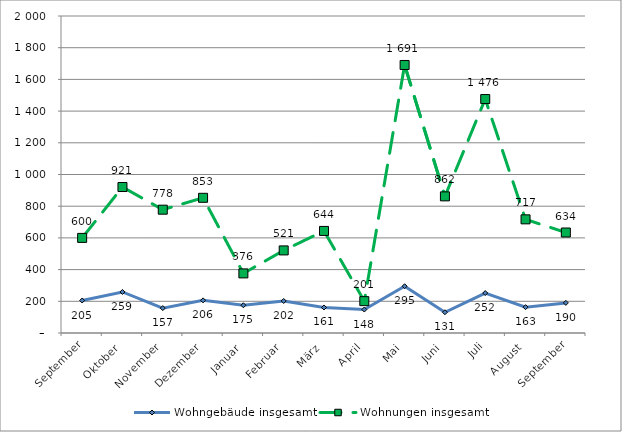
| Category | Wohngebäude insgesamt | Wohnungen insgesamt |
|---|---|---|
| September | 205 | 600 |
| Oktober | 259 | 921 |
| November | 157 | 778 |
| Dezember | 206 | 853 |
| Januar | 175 | 376 |
| Februar | 202 | 521 |
| März | 161 | 644 |
| April | 148 | 201 |
| Mai | 295 | 1691 |
| Juni | 131 | 862 |
| Juli | 252 | 1476 |
| August | 163 | 717 |
| September | 190 | 634 |